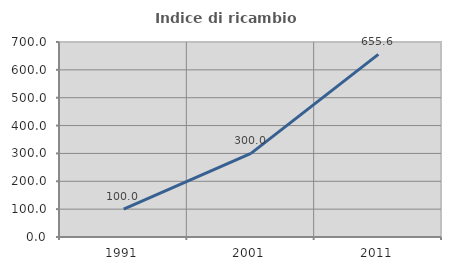
| Category | Indice di ricambio occupazionale  |
|---|---|
| 1991.0 | 100 |
| 2001.0 | 300 |
| 2011.0 | 655.556 |